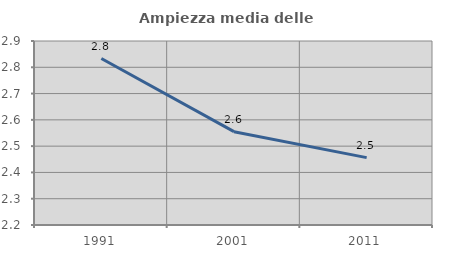
| Category | Ampiezza media delle famiglie |
|---|---|
| 1991.0 | 2.833 |
| 2001.0 | 2.555 |
| 2011.0 | 2.456 |